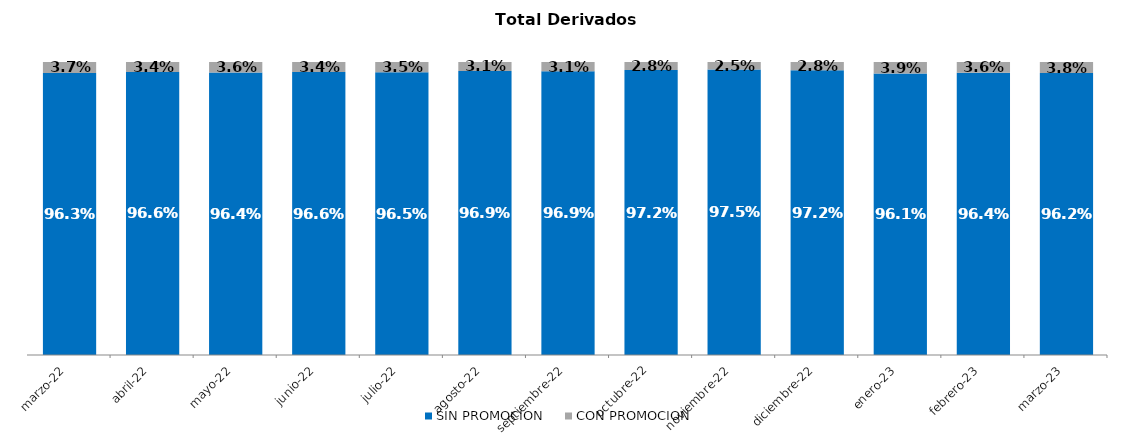
| Category | SIN PROMOCION   | CON PROMOCION   |
|---|---|---|
| 2022-03-01 | 0.963 | 0.037 |
| 2022-04-01 | 0.966 | 0.034 |
| 2022-05-01 | 0.964 | 0.036 |
| 2022-06-01 | 0.966 | 0.034 |
| 2022-07-01 | 0.965 | 0.035 |
| 2022-08-01 | 0.969 | 0.031 |
| 2022-09-01 | 0.969 | 0.031 |
| 2022-10-01 | 0.972 | 0.028 |
| 2022-11-01 | 0.975 | 0.025 |
| 2022-12-01 | 0.972 | 0.028 |
| 2023-01-01 | 0.961 | 0.039 |
| 2023-02-01 | 0.964 | 0.036 |
| 2023-03-01 | 0.962 | 0.038 |